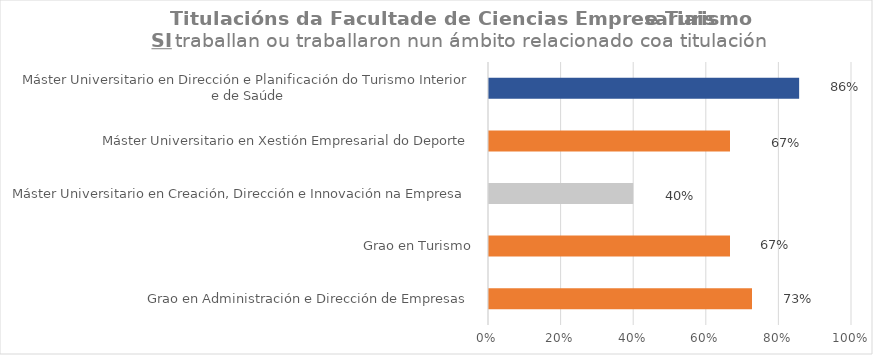
| Category | Series 0 |
|---|---|
| Grao en Administración e Dirección de Empresas | 0.727 |
| Grao en Turismo | 0.667 |
| Máster Universitario en Creación, Dirección e Innovación na Empresa | 0.4 |
| Máster Universitario en Xestión Empresarial do Deporte | 0.667 |
| Máster Universitario en Dirección e Planificación do Turismo Interior e de Saúde | 0.857 |